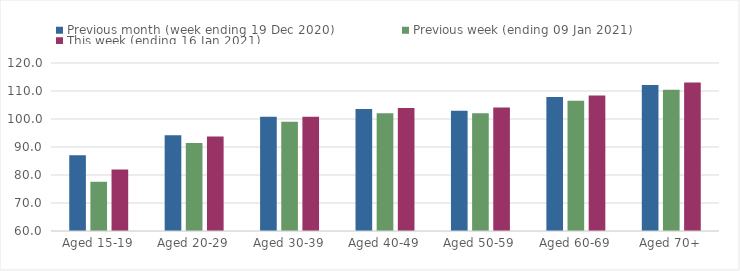
| Category | Previous month (week ending 19 Dec 2020) | Previous week (ending 09 Jan 2021) | This week (ending 16 Jan 2021) |
|---|---|---|---|
| Aged 15-19 | 87.07 | 77.58 | 81.98 |
| Aged 20-29 | 94.24 | 91.41 | 93.75 |
| Aged 30-39 | 100.78 | 99.06 | 100.79 |
| Aged 40-49 | 103.54 | 102.04 | 103.94 |
| Aged 50-59 | 102.94 | 102.04 | 104.09 |
| Aged 60-69 | 107.84 | 106.56 | 108.36 |
| Aged 70+ | 112.12 | 110.49 | 113.07 |